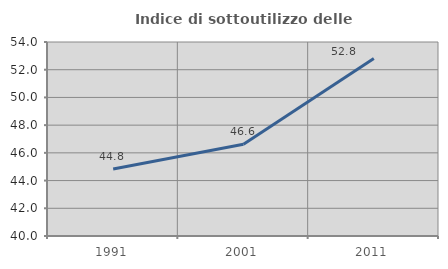
| Category | Indice di sottoutilizzo delle abitazioni  |
|---|---|
| 1991.0 | 44.832 |
| 2001.0 | 46.619 |
| 2011.0 | 52.805 |